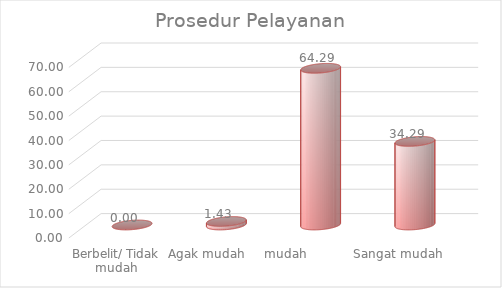
| Category | Prosedur Pelayanan |
|---|---|
| Berbelit/ Tidak mudah | 0 |
| Agak mudah  | 1.429 |
| mudah          | 64.286 |
| Sangat mudah | 34.286 |